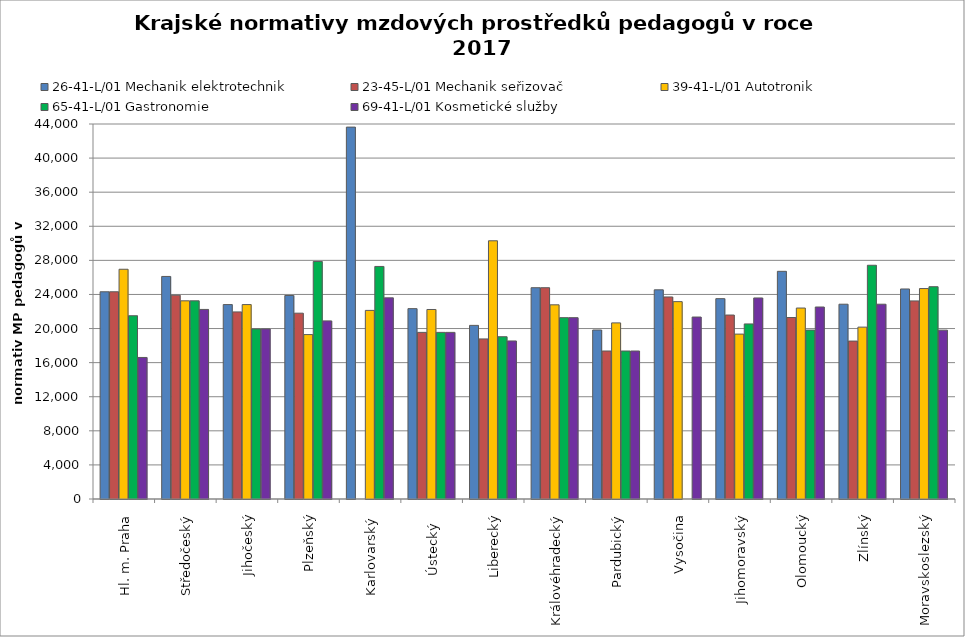
| Category | 26-41-L/01 Mechanik elektrotechnik | 23-45-L/01 Mechanik seřizovač | 39-41-L/01 Autotronik | 65-41-L/01 Gastronomie | 69-41-L/01 Kosmetické služby |
|---|---|---|---|---|---|
| Hl. m. Praha | 24313.725 | 24313.725 | 26956.522 | 21502.89 | 16607.143 |
| Středočeský | 26113.481 | 23915.448 | 23253.778 | 23253.056 | 22242.054 |
| Jihočeský | 22811.507 | 21951.493 | 22811.507 | 19953.661 | 19953.661 |
| Plzeňský | 23879.54 | 21802.452 | 19291.116 | 27871.343 | 20899.608 |
| Karlovarský  | 43636.364 | 0 | 22129.87 | 27285.829 | 23601.108 |
| Ústecký   | 22336.258 | 19548.955 | 22235.838 | 19548.955 | 19548.955 |
| Liberecký | 20370.339 | 18780.803 | 30296.004 | 19039.482 | 18543.254 |
| Královéhradecký | 24791.117 | 24791.117 | 22783.163 | 21276.951 | 21276.951 |
| Pardubický | 19828.956 | 17363.735 | 20663.86 | 17363.735 | 17363.735 |
| Vysočina | 24544.079 | 23706.816 | 23157.8 | 0 | 21350.335 |
| Jihomoravský | 23507.29 | 21584.126 | 19348.99 | 20542.178 | 23589.104 |
| Olomoucký | 26713.781 | 21295.775 | 22406.639 | 19821.709 | 22526.818 |
| Zlínský | 22855.2 | 18531.243 | 20166.353 | 27426.24 | 22855.2 |
| Moravskoslezský | 24643.432 | 23241.466 | 24693.083 | 24910.569 | 19810.345 |